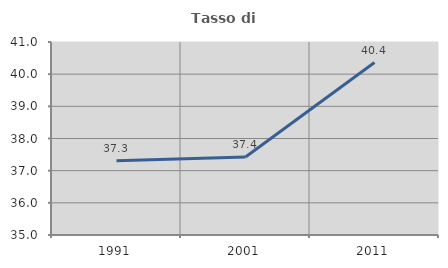
| Category | Tasso di occupazione   |
|---|---|
| 1991.0 | 37.307 |
| 2001.0 | 37.426 |
| 2011.0 | 40.362 |